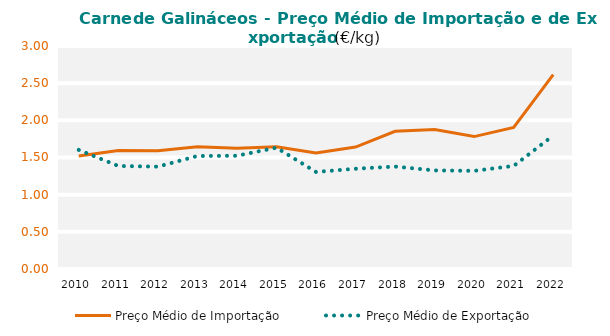
| Category | Preço Médio de Importação | Preço Médio de Exportação |
|---|---|---|
| 2010.0 | 1.521 | 1.602 |
| 2011.0 | 1.594 | 1.386 |
| 2012.0 | 1.59 | 1.377 |
| 2013.0 | 1.645 | 1.52 |
| 2014.0 | 1.623 | 1.524 |
| 2015.0 | 1.644 | 1.632 |
| 2016.0 | 1.562 | 1.306 |
| 2017.0 | 1.64 | 1.349 |
| 2018.0 | 1.852 | 1.378 |
| 2019.0 | 1.877 | 1.326 |
| 2020.0 | 1.781 | 1.321 |
| 2021.0 | 1.904 | 1.387 |
| 2022.0 | 2.615 | 1.795 |